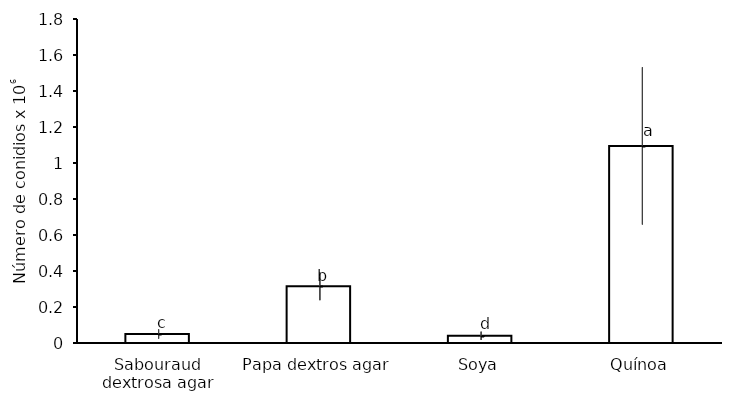
| Category | Media |
|---|---|
| Sabouraud dextrosa agar | 0.05 |
| Papa dextros agar | 0.315 |
| Soya | 0.04 |
| Quínoa | 1.095 |